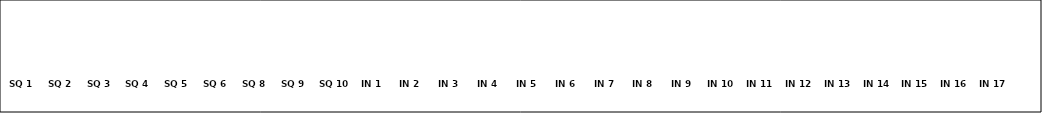
| Category | Series 0 |
|---|---|
| SQ 1 | 0 |
| SQ 2 | 0 |
| SQ 3 | 0 |
| SQ 4 | 0 |
| SQ 5 | 0 |
| SQ 6 | 0 |
| SQ 8 | 0 |
| SQ 9 | 0 |
| SQ 10 | 0 |
| IN 1 | 0 |
| IN 2 | 0 |
| IN 3 | 0 |
| IN 4 | 0 |
| IN 5 | 0 |
| IN 6 | 0 |
| IN 7 | 0 |
| IN 8 | 0 |
| IN 9 | 0 |
| IN 10 | 0 |
| IN 11 | 0 |
| IN 12 | 0 |
| IN 13 | 0 |
| IN 14 | 0 |
| IN 15 | 0 |
| IN 16 | 0 |
| IN 17 | 0 |